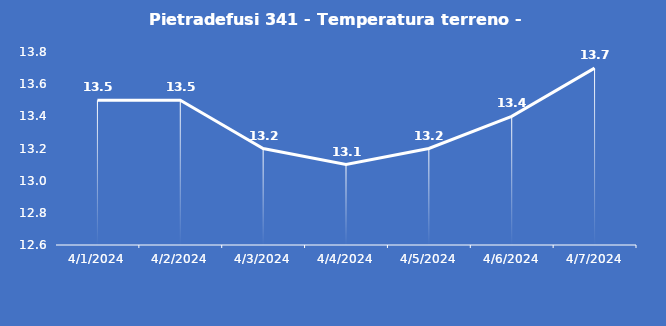
| Category | Pietradefusi 341 - Temperatura terreno - Grezzo (°C) |
|---|---|
| 4/1/24 | 13.5 |
| 4/2/24 | 13.5 |
| 4/3/24 | 13.2 |
| 4/4/24 | 13.1 |
| 4/5/24 | 13.2 |
| 4/6/24 | 13.4 |
| 4/7/24 | 13.7 |